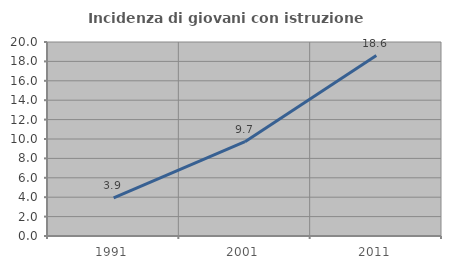
| Category | Incidenza di giovani con istruzione universitaria |
|---|---|
| 1991.0 | 3.933 |
| 2001.0 | 9.729 |
| 2011.0 | 18.596 |